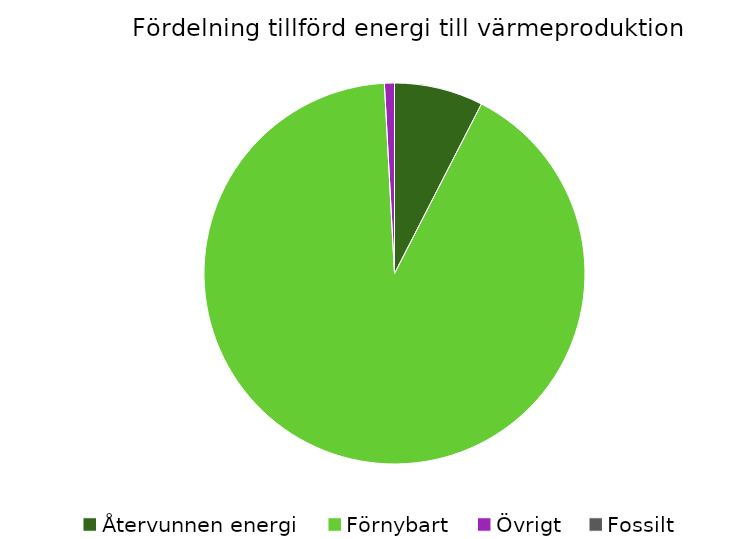
| Category | Fördelning värmeproduktion |
|---|---|
| Återvunnen energi | 0.075 |
| Förnybart | 0.916 |
| Övrigt | 0.008 |
| Fossilt | 0 |